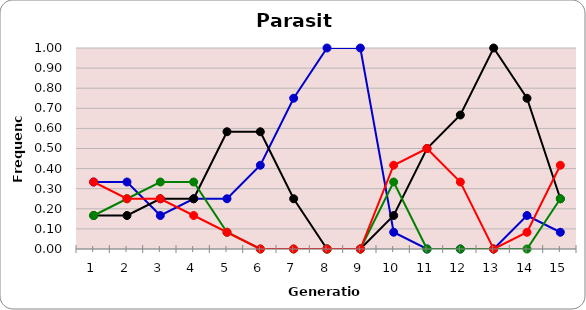
| Category | Sp | Cl | Di | He |
|---|---|---|---|---|
| 1.0 | 0.333 | 0.167 | 0.167 | 0.333 |
| 2.0 | 0.333 | 0.167 | 0.25 | 0.25 |
| 3.0 | 0.167 | 0.25 | 0.333 | 0.25 |
| 4.0 | 0.25 | 0.25 | 0.333 | 0.167 |
| 5.0 | 0.25 | 0.583 | 0.083 | 0.083 |
| 6.0 | 0.417 | 0.583 | 0 | 0 |
| 7.0 | 0.75 | 0.25 | 0 | 0 |
| 8.0 | 1 | 0 | 0 | 0 |
| 9.0 | 1 | 0 | 0 | 0 |
| 10.0 | 0.083 | 0.167 | 0.333 | 0.417 |
| 11.0 | 0 | 0.5 | 0 | 0.5 |
| 12.0 | 0 | 0.667 | 0 | 0.333 |
| 13.0 | 0 | 1 | 0 | 0 |
| 14.0 | 0.167 | 0.75 | 0 | 0.083 |
| 15.0 | 0.083 | 0.25 | 0.25 | 0.417 |